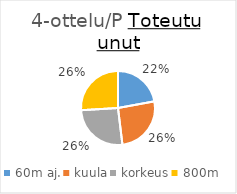
| Category | Series 0 |
|---|---|
| 60m aj. | 852 |
| kuula | 1000 |
| korkeus | 1000 |
| 800m | 1000 |